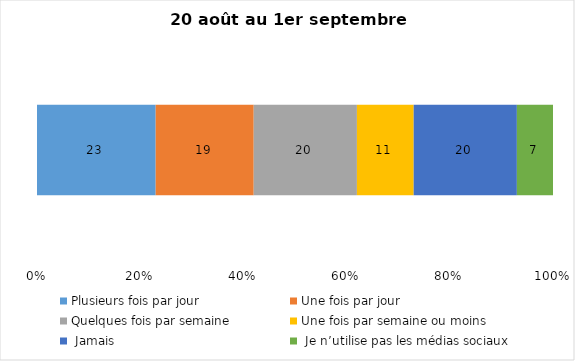
| Category | Plusieurs fois par jour | Une fois par jour | Quelques fois par semaine   | Une fois par semaine ou moins   |  Jamais   |  Je n’utilise pas les médias sociaux |
|---|---|---|---|---|---|---|
| 0 | 23 | 19 | 20 | 11 | 20 | 7 |